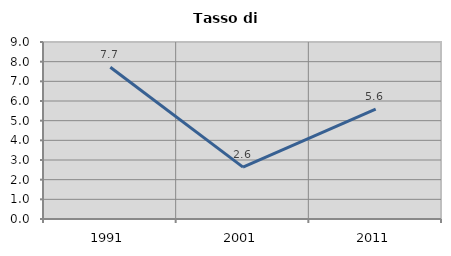
| Category | Tasso di disoccupazione   |
|---|---|
| 1991.0 | 7.715 |
| 2001.0 | 2.639 |
| 2011.0 | 5.591 |